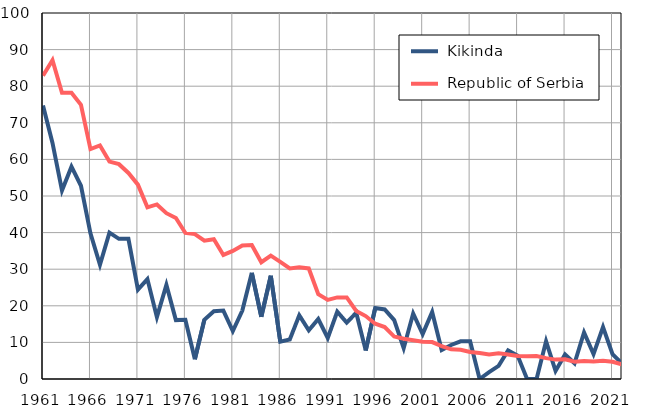
| Category |  Kikinda |  Republic of Serbia |
|---|---|---|
| 1961.0 | 74.7 | 82.9 |
| 1962.0 | 64.5 | 87.1 |
| 1963.0 | 51.5 | 78.2 |
| 1964.0 | 58 | 78.2 |
| 1965.0 | 52.8 | 74.9 |
| 1966.0 | 39.8 | 62.8 |
| 1967.0 | 31.2 | 63.8 |
| 1968.0 | 40 | 59.4 |
| 1969.0 | 38.3 | 58.7 |
| 1970.0 | 38.3 | 56.3 |
| 1971.0 | 24.4 | 53.1 |
| 1972.0 | 27.3 | 46.9 |
| 1973.0 | 16.9 | 47.7 |
| 1974.0 | 25.7 | 45.3 |
| 1975.0 | 16.1 | 44 |
| 1976.0 | 16.2 | 39.9 |
| 1977.0 | 5.4 | 39.6 |
| 1978.0 | 16.2 | 37.8 |
| 1979.0 | 18.5 | 38.2 |
| 1980.0 | 18.7 | 33.9 |
| 1981.0 | 13.1 | 35 |
| 1982.0 | 18.7 | 36.5 |
| 1983.0 | 29 | 36.6 |
| 1984.0 | 17 | 31.9 |
| 1985.0 | 28.2 | 33.7 |
| 1986.0 | 10.2 | 32 |
| 1987.0 | 10.8 | 30.2 |
| 1988.0 | 17.4 | 30.5 |
| 1989.0 | 13.3 | 30.2 |
| 1990.0 | 16.4 | 23.2 |
| 1991.0 | 11.2 | 21.6 |
| 1992.0 | 18.4 | 22.3 |
| 1993.0 | 15.4 | 22.3 |
| 1994.0 | 18.1 | 18.6 |
| 1995.0 | 7.8 | 17.2 |
| 1996.0 | 19.4 | 15.1 |
| 1997.0 | 19 | 14.2 |
| 1998.0 | 16.1 | 11.6 |
| 1999.0 | 8.4 | 11 |
| 2000.0 | 17.9 | 10.6 |
| 2001.0 | 12.3 | 10.2 |
| 2002.0 | 18.3 | 10.1 |
| 2003.0 | 7.9 | 9 |
| 2004.0 | 9.3 | 8.1 |
| 2005.0 | 10.3 | 8 |
| 2006.0 | 10.3 | 7.4 |
| 2007.0 | 0 | 7.1 |
| 2008.0 | 1.9 | 6.7 |
| 2009.0 | 3.6 | 7 |
| 2010.0 | 7.8 | 6.7 |
| 2011.0 | 6.4 | 6.3 |
| 2012.0 | 0 | 6.2 |
| 2013.0 | 0 | 6.3 |
| 2014.0 | 10.3 | 5.7 |
| 2015.0 | 2.2 | 5.3 |
| 2016.0 | 6.7 | 5.4 |
| 2017.0 | 4.3 | 4.7 |
| 2018.0 | 12.7 | 4.9 |
| 2019.0 | 6.8 | 4.8 |
| 2020.0 | 14.2 | 5 |
| 2021.0 | 6.8 | 4.7 |
| 2022.0 | 4.2 | 4 |